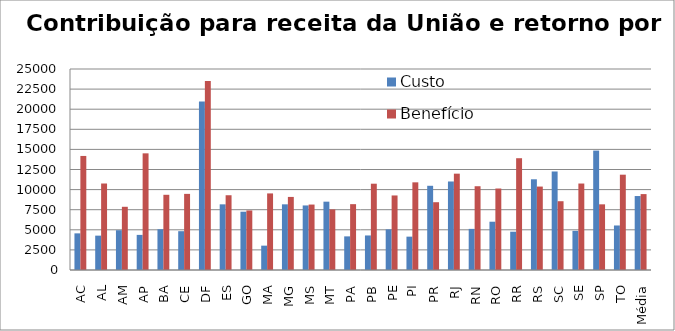
| Category | Custo | Benefício |
|---|---|---|
| _x0002_AC | 4558.052 | 14185.879 |
| _x0002_AL | 4273.603 | 10758.921 |
| _x0002_AM | 4948.426 | 7861.844 |
| _x0002_AP | 4367.111 | 14509.679 |
| _x0002_BA | 5067.683 | 9353.731 |
| _x0002_CE | 4827.834 | 9468.333 |
| _x0002_DF | 20965.433 | 23492.331 |
| _x0002_ES | 8167.251 | 9298.879 |
| _x0002_GO | 7249.194 | 7406.134 |
| _x0002_MA | 3028.961 | 9525.378 |
| _x0002_MG | 8169.153 | 9088.735 |
| _x0002_MS | 8028.994 | 8140.096 |
| _x0002_MT | 8499.421 | 7536.784 |
| _x0002_PA | 4182.812 | 8189.687 |
| _x0002_PB | 4296.65 | 10733.341 |
| _x0002_PE | 5054.037 | 9271.59 |
| _x0002_PI | 4148.789 | 10902.963 |
| _x0002_PR | 10473.899 | 8430.938 |
| _x0002_RJ | 11009.856 | 11981.761 |
| _x0002_RN | 5113.933 | 10419.535 |
| _x0002_RO | 6005.941 | 10134.671 |
| _x0002_RR | 4762.251 | 13903.395 |
| _x0002_RS | 11283.013 | 10377.86 |
| _x0002_SC | 12253.125 | 8554.513 |
| _x0002_SE | 4869.004 | 10755.06 |
| _x0002_SP | 14849.814 | 8167.656 |
| _x0002_TO | 5537.427 | 11854.818 |
| _x0005_Média | 9199.971 | 9441.441 |